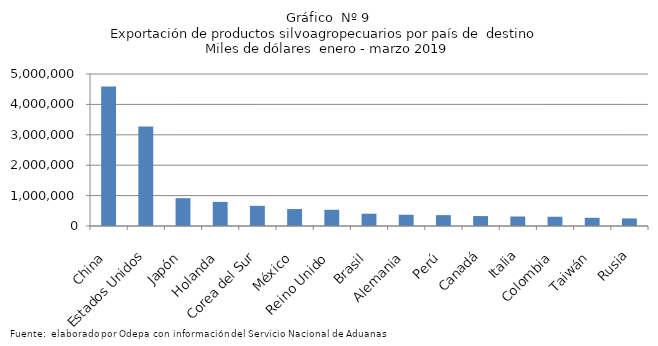
| Category | Series 0 |
|---|---|
| China | 4585674.573 |
| Estados Unidos | 3271812.14 |
| Japón | 915196.181 |
| Holanda | 793008.501 |
| Corea del Sur | 662962.613 |
| México | 557303.309 |
| Reino Unido | 534489.155 |
| Brasil | 403507.094 |
| Alemania | 370280.652 |
| Perú | 356856.574 |
| Canadá | 327250.41 |
| Italia | 313006.298 |
| Colombia | 304681.698 |
| Taiwán | 269379.056 |
| Rusia | 248857.953 |